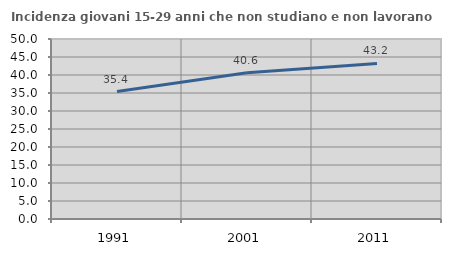
| Category | Incidenza giovani 15-29 anni che non studiano e non lavorano  |
|---|---|
| 1991.0 | 35.398 |
| 2001.0 | 40.606 |
| 2011.0 | 43.2 |